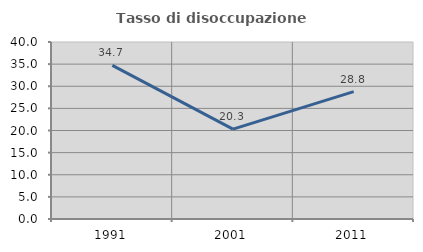
| Category | Tasso di disoccupazione giovanile  |
|---|---|
| 1991.0 | 34.706 |
| 2001.0 | 20.301 |
| 2011.0 | 28.79 |